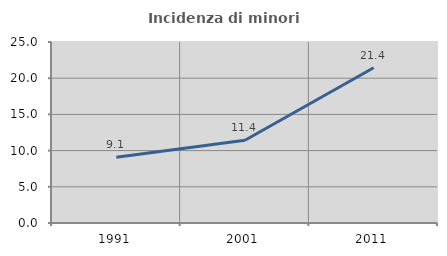
| Category | Incidenza di minori stranieri |
|---|---|
| 1991.0 | 9.091 |
| 2001.0 | 11.429 |
| 2011.0 | 21.446 |